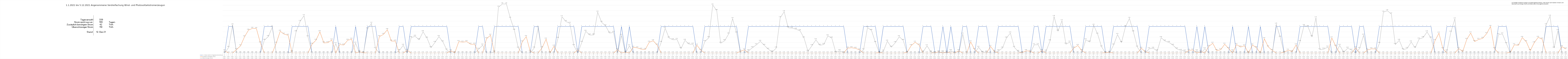
| Category | 1 = Strom reicht im Tagesdurchschnitt aus | Zusätzlich benötigter Strom | Überschüssiger Strom |
|---|---|---|---|
| 0 | 0 | 0.08 | 0 |
| 1 | 1 | 0 | 0.21 |
| 2 | 1 | 0 | 1.06 |
| 3 | 0 | 0.13 | 0 |
| 4 | 0 | 0.27 | 0 |
| 5 | 0 | 0.61 | 0 |
| 6 | 0 | 0.86 | 0 |
| 7 | 0 | 0.93 | 0 |
| 8 | 0 | 0.92 | 0 |
| 9 | 0 | 0.38 | 0 |
| 10 | 1 | 0 | 0.48 |
| 11 | 1 | 0 | 0.62 |
| 12 | 1 | 0 | 0.97 |
| 13 | 0 | 0.37 | 0 |
| 14 | 0 | 0.82 | 0 |
| 15 | 0 | 0.71 | 0 |
| 16 | 0 | 0.67 | 0 |
| 17 | 1 | 0 | 0.05 |
| 18 | 1 | 0 | 0.8 |
| 19 | 1 | 0 | 1.19 |
| 20 | 1 | 0 | 1.41 |
| 21 | 1 | 0 | 0.61 |
| 22 | 0 | 0.33 | 0 |
| 23 | 0 | 0.48 | 0 |
| 24 | 0 | 0.8 | 0 |
| 25 | 0 | 0.38 | 0 |
| 26 | 0 | 0.39 | 0 |
| 27 | 0 | 0.49 | 0 |
| 28 | 1 | 0 | 0.35 |
| 29 | 0 | 0.32 | 0 |
| 30 | 0 | 0.3 | 0 |
| 31 | 0 | 0.48 | 0 |
| 32 | 0 | 0.52 | 0 |
| 33 | 1 | 0 | 0.37 |
| 34 | 0 | 0.05 | 0 |
| 35 | 0 | 0.01 | 0 |
| 36 | 1 | 0 | 0.91 |
| 37 | 1 | 0 | 1.12 |
| 38 | 1 | 0 | 0.17 |
| 39 | 0 | 0.62 | 0 |
| 40 | 0 | 0.7 | 0 |
| 41 | 0 | 0.88 | 0 |
| 42 | 0 | 0.45 | 0 |
| 43 | 0 | 0.45 | 0 |
| 44 | 1 | 0 | 0.09 |
| 45 | 1 | 0 | 0.29 |
| 46 | 0 | 0.1 | 0 |
| 47 | 1 | 0 | 0.58 |
| 48 | 1 | 0 | 0.63 |
| 49 | 1 | 0 | 0.5 |
| 50 | 1 | 0 | 0.8 |
| 51 | 1 | 0 | 0.56 |
| 52 | 1 | 0 | 0.2 |
| 53 | 1 | 0 | 0.4 |
| 54 | 1 | 0 | 0.62 |
| 55 | 1 | 0 | 0.42 |
| 56 | 1 | 0 | 0.11 |
| 57 | 0 | 0.08 | 0 |
| 58 | 0 | 0.01 | 0 |
| 59 | 0 | 0.43 | 0 |
| 60 | 0 | 0.41 | 0 |
| 61 | 0 | 0.43 | 0 |
| 62 | 0 | 0.33 | 0 |
| 63 | 0 | 0.33 | 0 |
| 64 | 1 | 0 | 0.14 |
| 65 | 1 | 0 | 0.3 |
| 66 | 0 | 0.54 | 0 |
| 67 | 0 | 0.67 | 0 |
| 68 | 1 | 0 | 0.04 |
| 69 | 1 | 0 | 1.73 |
| 70 | 1 | 0 | 1.85 |
| 71 | 1 | 0 | 1.85 |
| 72 | 1 | 0 | 1.31 |
| 73 | 1 | 0 | 0.861 |
| 74 | 1 | 0 | 0.185 |
| 75 | 0 | 0.42 | 0 |
| 76 | 0 | 0.619 | 0 |
| 77 | 0 | 0.064 | 0 |
| 78 | 1 | 0 | 0.187 |
| 79 | 1 | 0 | 0.946 |
| 80 | 0 | 0.198 | 0 |
| 81 | 0 | 0.523 | 0 |
| 82 | 0 | 0.007 | 0 |
| 83 | 0 | 0.257 | 0 |
| 84 | 1 | 0 | 0.555 |
| 85 | 1 | 0 | 1.369 |
| 86 | 1 | 0 | 1.186 |
| 87 | 1 | 0 | 1.12 |
| 88 | 1 | 0 | 0.278 |
| 89 | 0 | 0.117 | 0 |
| 90 | 1 | 0 | 0.403 |
| 91 | 1 | 0 | 0.819 |
| 92 | 1 | 0 | 0.676 |
| 93 | 1 | 0 | 0.681 |
| 94 | 1 | 0 | 1.541 |
| 95 | 1 | 0 | 1.158 |
| 96 | 1 | 0 | 1.022 |
| 97 | 1 | 0 | 0.752 |
| 98 | 1 | 0 | 0.776 |
| 99 | 0 | 0.123 | 0 |
| 100 | 1 | 0 | 0.665 |
| 101 | 0 | 0.034 | 0 |
| 102 | 1 | 0 | 0.269 |
| 103 | 0 | 0.218 | 0 |
| 104 | 0 | 0.193 | 0 |
| 105 | 0 | 0.144 | 0 |
| 106 | 0 | 0.133 | 0 |
| 107 | 0 | 0.407 | 0 |
| 108 | 0 | 0.46 | 0 |
| 109 | 0 | 0.3 | 0 |
| 110 | 1 | 0 | 0.402 |
| 111 | 1 | 0 | 0.934 |
| 112 | 1 | 0 | 0.567 |
| 113 | 1 | 0 | 0.498 |
| 114 | 1 | 0 | 0.509 |
| 115 | 1 | 0 | 0.167 |
| 116 | 1 | 0 | 0.478 |
| 117 | 1 | 0 | 0.336 |
| 118 | 1 | 0 | 0.331 |
| 119 | 0 | 0.296 | 0 |
| 120 | 0 | 0.103 | 0 |
| 121 | 1 | 0 | 0.432 |
| 122 | 1 | 0 | 0.575 |
| 123 | 1 | 0 | 1.808 |
| 124 | 1 | 0 | 1.602 |
| 125 | 1 | 0 | 0.369 |
| 126 | 1 | 0 | 0.463 |
| 127 | 1 | 0 | 0.716 |
| 128 | 1 | 0 | 1.296 |
| 129 | 1 | 0 | 0.755 |
| 130 | 0 | 0.067 | 0 |
| 131 | 0 | 0.117 | 0 |
| 132 | 1 | 0 | 0.081 |
| 133 | 1 | 0 | 0.2 |
| 134 | 1 | 0 | 0.31 |
| 135 | 1 | 0 | 0.44 |
| 136 | 1 | 0 | 0.289 |
| 137 | 1 | 0 | 0.142 |
| 138 | 1 | 0 | 0.041 |
| 139 | 1 | 0 | 0.186 |
| 140 | 1 | 0 | 1.332 |
| 141 | 1 | 0 | 1.555 |
| 142 | 1 | 0 | 0.955 |
| 143 | 1 | 0 | 0.938 |
| 144 | 1 | 0 | 0.894 |
| 145 | 1 | 0 | 0.838 |
| 146 | 1 | 0 | 0.567 |
| 147 | 1 | 0 | 0.064 |
| 148 | 1 | 0 | 0.276 |
| 149 | 1 | 0 | 0.498 |
| 150 | 1 | 0 | 0.292 |
| 151 | 1 | 0 | 0.321 |
| 152 | 1 | 0 | 0.646 |
| 153 | 1 | 0 | 0.563 |
| 154 | 1 | 0 | 0.026 |
| 155 | 1 | 0 | 0.087 |
| 156 | 1 | 0 | 0.009 |
| 157 | 0 | 0.184 | 0 |
| 158 | 0 | 0.199 | 0 |
| 159 | 0 | 0.177 | 0 |
| 160 | 0 | 0.116 | 0 |
| 161 | 1 | 0 | 0.12 |
| 162 | 1 | 0 | 0.959 |
| 163 | 1 | 0 | 0.851 |
| 164 | 1 | 0 | 0.397 |
| 165 | 0 | 0.017 | 0 |
| 166 | 1 | 0 | 0.069 |
| 167 | 1 | 0 | 0.445 |
| 168 | 1 | 0 | 0.221 |
| 169 | 1 | 0 | 0.389 |
| 170 | 1 | 0 | 0.615 |
| 171 | 1 | 0 | 0.476 |
| 172 | 0 | 0.027 | 0 |
| 173 | 0 | 0.28 | 0 |
| 174 | 0 | 0.406 | 0 |
| 175 | 0 | 0.3 | 0 |
| 176 | 1 | 0 | 0.042 |
| 177 | 1 | 0 | 0.271 |
| 178 | 1 | 0 | 0.038 |
| 179 | 0 | 0.014 | 0 |
| 180 | 0 | 0.049 | 0 |
| 181 | 1 | 0 | 0.046 |
| 182 | 0 | 0.038 | 0 |
| 183 | 1 | 0 | 0.09 |
| 184 | 0 | 0.005 | 0 |
| 185 | 0 | 0.084 | 0 |
| 186 | 1 | 0 | 0.711 |
| 187 | 1 | 0 | 0.006 |
| 188 | 0 | 0.419 | 0 |
| 189 | 0 | 0.129 | 0 |
| 190 | 1 | 0 | 0.215 |
| 191 | 1 | 0 | 0.026 |
| 192 | 1 | 0 | 0.038 |
| 193 | 0 | 0.249 | 0 |
| 194 | 0 | 0.057 | 0 |
| 195 | 1 | 0 | 0.084 |
| 196 | 1 | 0 | 0.185 |
| 197 | 1 | 0 | 0.563 |
| 198 | 1 | 0 | 0.753 |
| 199 | 1 | 0 | 0.212 |
| 200 | 1 | 0 | 0.058 |
| 201 | 0 | 0.018 | 0 |
| 202 | 0 | 0.087 | 0 |
| 203 | 0 | 0.063 | 0 |
| 204 | 1 | 0 | 0.307 |
| 205 | 1 | 0 | 0.312 |
| 206 | 0 | 0.092 | 0 |
| 207 | 1 | 0 | 0.071 |
| 208 | 1 | 0 | 0.458 |
| 209 | 1 | 0 | 1.377 |
| 210 | 1 | 0 | 0.826 |
| 211 | 1 | 0 | 1.216 |
| 212 | 1 | 0 | 0.333 |
| 213 | 1 | 0 | 0.411 |
| 214 | 0 | 0.189 | 0 |
| 215 | 0 | 0.284 | 0 |
| 216 | 0 | 0.088 | 0 |
| 217 | 1 | 0 | 0.496 |
| 218 | 1 | 0 | 0.417 |
| 219 | 1 | 0 | 1.046 |
| 220 | 1 | 0 | 0.708 |
| 221 | 1 | 0 | 0.229 |
| 222 | 0 | 0.015 | 0 |
| 223 | 0 | 0.029 | 0 |
| 224 | 1 | 0 | 0.301 |
| 225 | 1 | 0 | 0.696 |
| 226 | 1 | 0 | 0.397 |
| 227 | 1 | 0 | 0.987 |
| 228 | 1 | 0 | 1.305 |
| 229 | 1 | 0 | 0.797 |
| 230 | 1 | 0 | 0.223 |
| 231 | 0 | 0.18 | 0 |
| 232 | 0 | 0.049 | 0 |
| 233 | 1 | 0 | 0.158 |
| 234 | 1 | 0 | 0.178 |
| 235 | 1 | 0 | 0.078 |
| 236 | 1 | 0 | 0.577 |
| 237 | 1 | 0 | 0.449 |
| 238 | 1 | 0 | 0.398 |
| 239 | 1 | 0 | 0.292 |
| 240 | 1 | 0 | 0.153 |
| 241 | 1 | 0 | 0.097 |
| 242 | 1 | 0 | 0.074 |
| 243 | 0 | 0.103 | 0 |
| 244 | 0 | 0.112 | 0 |
| 245 | 1 | 0 | 0.078 |
| 246 | 0 | 0.056 | 0 |
| 247 | 1 | 0 | 0.156 |
| 248 | 0 | 0.249 | 0 |
| 249 | 0 | 0.367 | 0 |
| 250 | 0 | 0.092 | 0 |
| 251 | 0 | 0.123 | 0 |
| 252 | 0 | 0.331 | 0 |
| 253 | 0 | 0.17 | 0 |
| 254 | 1 | 0 | 0.078 |
| 255 | 0 | 0.317 | 0 |
| 256 | 0 | 0.226 | 0 |
| 257 | 0 | 0.274 | 0 |
| 258 | 1 | 0 | 0.02 |
| 259 | 0 | 0.301 | 0 |
| 260 | 0 | 0.203 | 0 |
| 261 | 1 | 0 | 0.011 |
| 262 | 0 | 0.537 | 0 |
| 263 | 0 | 0.23 | 0 |
| 264 | 0 | 0.096 | 0 |
| 265 | 1 | 0 | 1.087 |
| 266 | 1 | 0 | 0.594 |
| 267 | 0 | 0.029 | 0 |
| 268 | 0 | 0.108 | 0 |
| 269 | 0 | 0.055 | 0 |
| 270 | 0 | 0.304 | 0 |
| 271 | 1 | 0 | 0.433 |
| 272 | 1 | 0 | 1.035 |
| 273 | 1 | 0 | 0.991 |
| 274 | 1 | 0 | 0.612 |
| 275 | 1 | 0 | 1.327 |
| 276 | 1 | 0 | 0.123 |
| 277 | 1 | 0 | 0.147 |
| 278 | 1 | 0 | 0.223 |
| 279 | 0 | 0.566 | 0 |
| 280 | 0 | 0.256 | 0 |
| 281 | 1 | 0 | 0.288 |
| 282 | 1 | 0 | 0.028 |
| 283 | 1 | 0 | 0.181 |
| 284 | 1 | 0 | 0.109 |
| 285 | 0 | 0.196 | 0 |
| 286 | 1 | 0 | 0.167 |
| 287 | 1 | 0 | 0.672 |
| 288 | 0 | 0.113 | 0 |
| 289 | 0 | 0.159 | 0 |
| 290 | 0 | 0.153 | 0 |
| 291 | 1 | 0 | 0.362 |
| 292 | 1 | 0 | 1.54 |
| 293 | 1 | 0 | 1.594 |
| 294 | 1 | 0 | 1.472 |
| 295 | 1 | 0 | 0.321 |
| 296 | 1 | 0 | 0.479 |
| 297 | 1 | 0 | 0.125 |
| 298 | 1 | 0 | 0.171 |
| 299 | 1 | 0 | 0.416 |
| 300 | 1 | 0 | 0.197 |
| 301 | 1 | 0 | 0.525 |
| 302 | 1 | 0 | 0.579 |
| 303 | 1 | 0 | 0.794 |
| 304 | 1 | 0 | 0.562 |
| 305 | 0 | 0.466 | 0 |
| 306 | 0 | 0.747 | 0 |
| 307 | 0 | 0.162 | 0 |
| 308 | 1 | 0 | 0.076 |
| 309 | 1 | 0 | 0.786 |
| 310 | 1 | 0 | 1.284 |
| 311 | 0 | 0.166 | 0 |
| 312 | 0 | 0.062 | 0 |
| 313 | 0 | 0.512 | 0 |
| 314 | 0 | 0.754 | 0 |
| 315 | 0 | 0.432 | 0 |
| 316 | 0 | 0.512 | 0 |
| 317 | 0 | 0.552 | 0 |
| 318 | 0 | 0.728 | 0 |
| 319 | 0 | 1.001 | 0 |
| 320 | 0 | 0.163 | 0 |
| 321 | 1 | 0 | 0.695 |
| 322 | 1 | 0 | 0.717 |
| 323 | 1 | 0 | 0.353 |
| 324 | 0 | 0.028 | 0 |
| 325 | 0 | 0.312 | 0 |
| 326 | 0 | 0.288 | 0 |
| 327 | 0 | 0.583 | 0 |
| 328 | 0 | 0.426 | 0 |
| 329 | 0 | 0.09 | 0 |
| 330 | 0 | 0.386 | 0 |
| 331 | 0 | 0.589 | 0 |
| 332 | 0 | 0.526 | 0 |
| 333 | 1 | 0 | 1.065 |
| 334 | 1 | 0 | 1.387 |
| 335 | 1 | 0 | 0.189 |
| 336 | 1 | 0 | 0.838 |
| 337 | 0 | 0.24 | 0 |
| 338 | 0 | 0.152 | 0 |